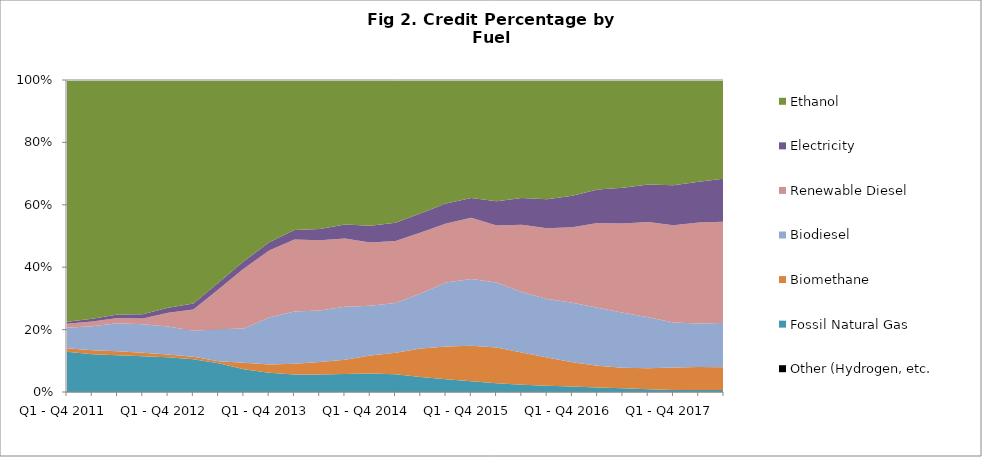
| Category | Other (Hydrogen, etc.) | Fossil Natural Gas | Biomethane | Biodiesel | Renewable Diesel | Electricity | Ethanol |
|---|---|---|---|---|---|---|---|
| Q1 - Q4 2011 | 0 | 41097.5 | 3678.75 | 20840.25 | 4255 | 1935.75 | 247389.25 |
| Q2 2011 - Q1 2012 | 0 | 41170.5 | 4217.5 | 26379.75 | 5162.75 | 2950.75 | 260276 |
| Q3 2011 - Q2 2012 | 0 | 41417.75 | 4505.5 | 31532.5 | 6021.75 | 4017.5 | 264182.75 |
| Q4 2011 - Q3 2012 | 0 | 43542.5 | 4159.75 | 34529 | 6915.75 | 5227.25 | 284618.5 |
| Q1 - Q4 2012 | 0 | 45792.5 | 3711.25 | 37075.5 | 18164.75 | 6746 | 301107.5 |
| Q2 2012 - Q1 2013 | 0 | 50547.5 | 3679.5 | 40197.75 | 32588.75 | 9379 | 344381.5 |
| Q3 2012 - Q2 2013 | 0 | 54271 | 3919.25 | 60249.5 | 75429 | 12868 | 381959.75 |
| Q4 2012 - Q3 2013 | 0 | 54494 | 15303.75 | 82533.25 | 143769 | 17304.25 | 434055.75 |
| Q1 - Q4 2013 | 0 | 55487 | 24517.25 | 136136.75 | 194327.5 | 23488.25 | 470916 |
| Q2 2013 - Q1 2014 | 0 | 55101.5 | 33883.25 | 164111.25 | 226272 | 30163.75 | 471152 |
| Q3 2013 - Q2 2014 | 0 | 58197.25 | 42046.25 | 172804.25 | 234481.75 | 38057.75 | 498469.5 |
| Q4 2013 - Q3 2014 | 0 | 60710.25 | 47887.5 | 177851.75 | 229188 | 46639.5 | 485098 |
| Q1 - Q4 2014 | 0 | 61841.25 | 59811.5 | 165836.75 | 211046.5 | 55332.5 | 485724.25 |
| Q2 2014 - Q1 2015 | 0 | 61021 | 74716.5 | 170801 | 214016.25 | 63321.25 | 492165 |
| Q3 2014 - Q2 2015 | 0 | 54408.25 | 102903.75 | 199124.25 | 220953 | 70066.25 | 482632.75 |
| Q4 2014 - Q3 2015 | 12.5 | 49846.25 | 127871.25 | 249213.5 | 230114.25 | 77983.75 | 481646.25 |
| Q1 - Q4 2015 | 18.5 | 45377.25 | 150052.5 | 283439.5 | 258369.75 | 84435 | 499094.75 |
| Q2 2015 - Q1 2016 | 26.75 | 41742.25 | 172380.25 | 314102 | 273983.25 | 117624 | 584025.25 |
| Q3 2015 - Q2 2016 | 33.75 | 41127 | 183953.5 | 343775.25 | 381638 | 152143.25 | 670777.5 |
| Q4 2015 - Q3 2016 | 21.5 | 40465 | 179614.5 | 375404 | 451819.25 | 185794.25 | 762747 |
| Q1 - Q4 2016 | 16 | 39794 | 173348.5 | 427747.25 | 540987.5 | 226393.5 | 829199.75 |
| Q2 2016 - Q1 2017 | 148.25 | 33787 | 159849.5 | 429067.25 | 626512.75 | 247688.75 | 810391.75 |
| Q3 2016 - Q2 2017 | 346.25 | 26959.25 | 153979 | 411953 | 667435.25 | 267404 | 805104.25 |
| Q4 2016 - Q3 2017 | 588.5 | 20513.25 | 161521 | 392049.25 | 733547.25 | 286840.25 | 804243.75 |
| Q1 - Q4 2017 | 859 | 14674 | 170199 | 343609.25 | 739760.75 | 303525 | 801216.5 |
| Q2 2017 - Q1 2018 | 1070.5 | 14612.25 | 180879 | 341363 | 793286.25 | 319346.25 | 798338.25 |
| Q3 2017 - Q2 2018 | 1281.5 | 15253 | 179767.25 | 349032.75 | 802783.5 | 339260.5 | 781104.25 |